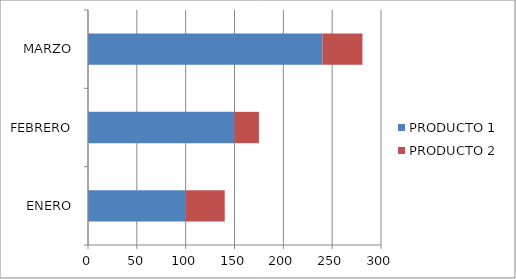
| Category | PRODUCTO 1 | PRODUCTO 2 |
|---|---|---|
| ENERO | 100 | 40 |
| FEBRERO | 150 | 25 |
| MARZO | 240 | 41 |